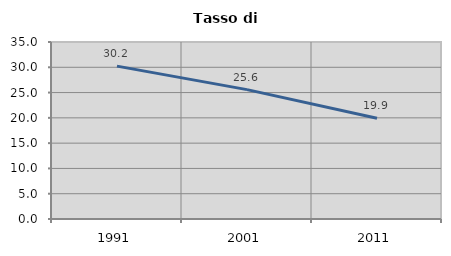
| Category | Tasso di disoccupazione   |
|---|---|
| 1991.0 | 30.227 |
| 2001.0 | 25.581 |
| 2011.0 | 19.931 |